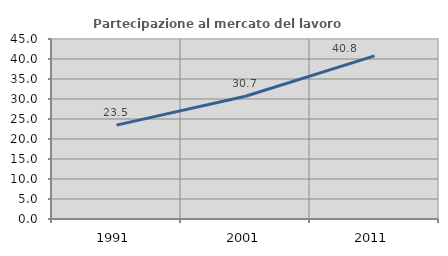
| Category | Partecipazione al mercato del lavoro  femminile |
|---|---|
| 1991.0 | 23.473 |
| 2001.0 | 30.696 |
| 2011.0 | 40.767 |